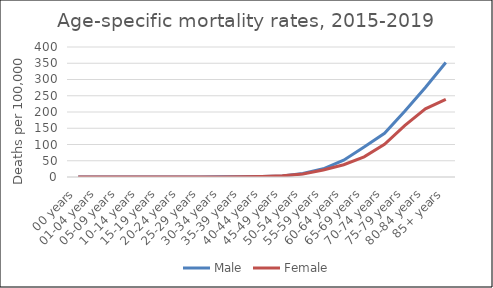
| Category | Male | Female |
|---|---|---|
| 00 years | 0 | 0 |
| 01-04 years | 0 | 0 |
| 05-09 years | 0 | 0 |
| 10-14 years | 0 | 0 |
| 15-19 years | 0 | 0 |
| 20-24 years | 0 | 0 |
| 25-29 years | 0 | 0 |
| 30-34 years | 0.52 | 0 |
| 35-39 years | 1.07 | 0.74 |
| 40-44 years | 1.56 | 1.75 |
| 45-49 years | 3.25 | 3.71 |
| 50-54 years | 10.77 | 9.56 |
| 55-59 years | 25.35 | 21.46 |
| 60-64 years | 51.76 | 37.72 |
| 65-69 years | 92.39 | 62.14 |
| 70-74 years | 134.41 | 100.47 |
| 75-79 years | 202.77 | 158.7 |
| 80-84 years | 275.66 | 209.64 |
| 85+ years | 352.28 | 238.69 |